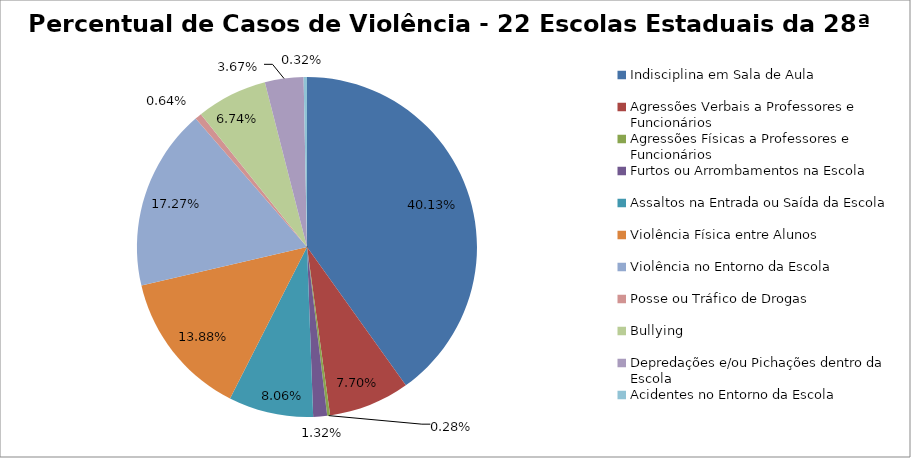
| Category | Percentual |
|---|---|
| Indisciplina em Sala de Aula | 0.401 |
| Agressões Verbais a Professores e Funcionários | 0.077 |
| Agressões Físicas a Professores e Funcionários | 0.003 |
| Furtos ou Arrombamentos na Escola | 0.013 |
| Assaltos na Entrada ou Saída da Escola | 0.081 |
| Violência Física entre Alunos | 0.139 |
| Violência no Entorno da Escola | 0.173 |
| Posse ou Tráfico de Drogas | 0.006 |
| Bullying | 0.067 |
| Depredações e/ou Pichações dentro da Escola | 0.037 |
| Acidentes no Entorno da Escola | 0.003 |